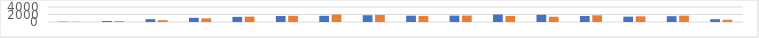
| Category | Series 0 | Series 1 |
|---|---|---|
| 7:00-8:00 | 84 | 68 |
| 8:00-9:00 | 272 | 232 |
| 9:00-10:00 | 756 | 480 |
| 10:00-11:00 | 1112 | 964 |
| 11:00-12:00 | 1368 | 1432 |
| 12:00-13:00 | 1608 | 1648 |
| 13:00-14:00 | 1648 | 1988 |
| 14:00-15:00 | 1808 | 1868 |
| 15:00-16:00 | 1684 | 1592 |
| 16:00-17:00 | 1700 | 1716 |
| 17:00-18:00 | 2004 | 1616 |
| 18:00-19:00 | 1948 | 1404 |
| 19:00-20:00 | 1604 | 1776 |
| 20:00-21:00 | 1428 | 1512 |
| 21:00-22:00 | 1548 | 1688 |
| 22:00-23:00 | 748 | 596 |